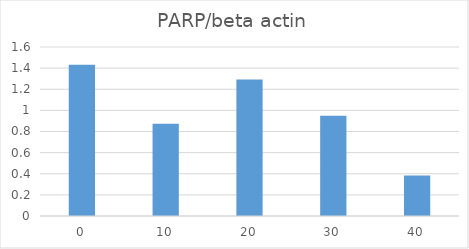
| Category | PARP/beta actin |
|---|---|
| 0.0 | 1.431 |
| 10.0 | 0.872 |
| 20.0 | 1.293 |
| 30.0 | 0.949 |
| 40.0 | 0.383 |